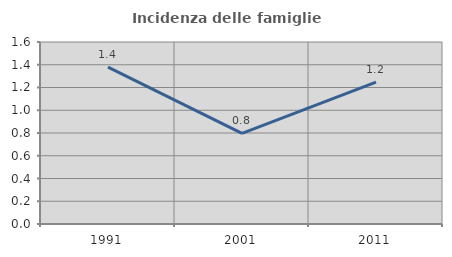
| Category | Incidenza delle famiglie numerose |
|---|---|
| 1991.0 | 1.379 |
| 2001.0 | 0.796 |
| 2011.0 | 1.247 |